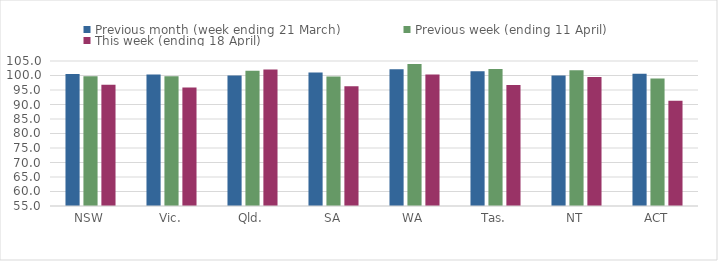
| Category | Previous month (week ending 21 March) | Previous week (ending 11 April) | This week (ending 18 April) |
|---|---|---|---|
| NSW | 100.531 | 99.717 | 96.777 |
| Vic. | 100.322 | 99.703 | 95.899 |
| Qld. | 99.966 | 101.603 | 102.111 |
| SA | 101.022 | 99.614 | 96.253 |
| WA | 102.126 | 103.969 | 100.305 |
| Tas. | 101.436 | 102.278 | 96.767 |
| NT | 100 | 101.813 | 99.521 |
| ACT | 100.585 | 98.942 | 91.316 |